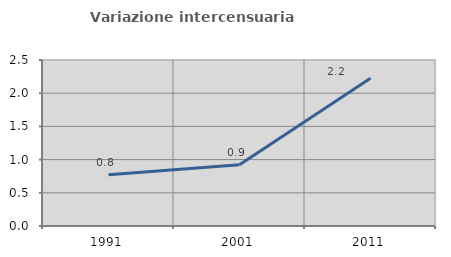
| Category | Variazione intercensuaria annua |
|---|---|
| 1991.0 | 0.771 |
| 2001.0 | 0.923 |
| 2011.0 | 2.224 |